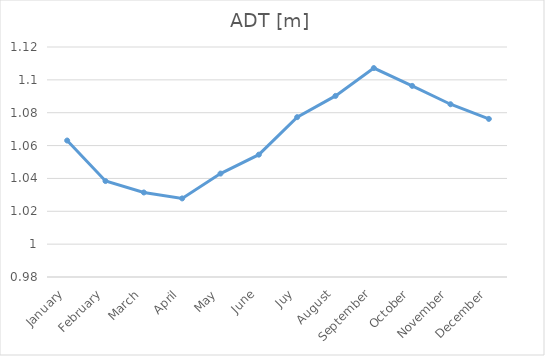
| Category | SLA |
|---|---|
| January | 1.063 |
| February | 1.038 |
| March | 1.031 |
| April | 1.028 |
| May | 1.043 |
| June | 1.054 |
| Juy | 1.077 |
| August | 1.09 |
| September | 1.107 |
| October | 1.096 |
| November | 1.085 |
| December | 1.076 |